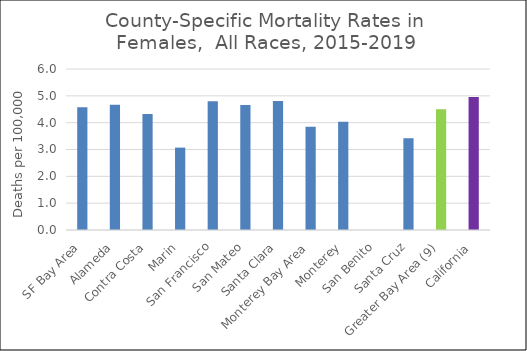
| Category | Female |
|---|---|
| SF Bay Area | 4.57 |
|   Alameda | 4.67 |
|   Contra Costa | 4.32 |
|   Marin | 3.07 |
|   San Francisco | 4.8 |
|   San Mateo | 4.66 |
|   Santa Clara | 4.81 |
| Monterey Bay Area | 3.85 |
|   Monterey | 4.03 |
|   San Benito | 0 |
|   Santa Cruz | 3.42 |
| Greater Bay Area (9) | 4.5 |
| California | 4.96 |